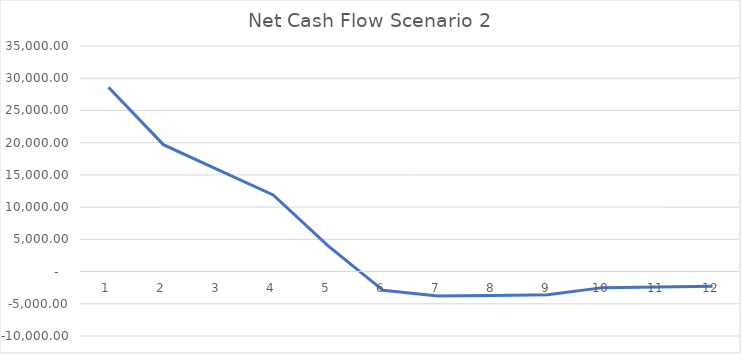
| Category | Series 0 |
|---|---|
| 0 | 28596 |
| 1 | 19693 |
| 2 | 15791 |
| 3 | 11890 |
| 4 | 3990 |
| 5 | -2909 |
| 6 | -3807 |
| 7 | -3704 |
| 8 | -3600 |
| 9 | -2495 |
| 10 | -2389 |
| 11 | -2282 |